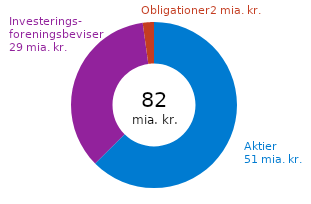
| Category | Afkast, mia. kr. |
|---|---|
| Børsnoterede aktier | 51.367 |
| Investeringsforeningsbeviser | 28.973 |
| Obligationer | 1.791 |